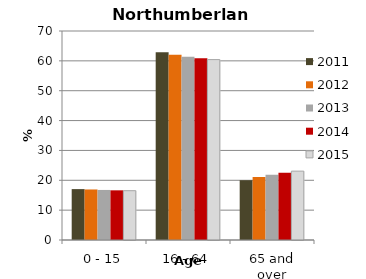
| Category | 2011 | 2012 | 2013 | 2014 | 2015 |
|---|---|---|---|---|---|
| 0 - 15 | 17.045 | 16.925 | 16.765 | 16.637 | 16.514 |
| 16 - 64 | 62.924 | 62.006 | 61.387 | 60.848 | 60.419 |
| 65 and over | 20.031 | 21.101 | 21.848 | 22.515 | 23.067 |